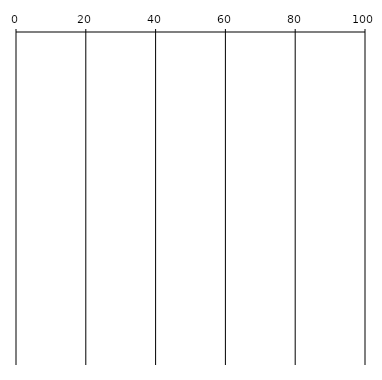
| Category | Series 0 | Series 1 | Series 2 | Series 3 | Series 4 | Series 5 | Series 6 | Series 7 | Series 8 | Series 9 | Series 10 | Series 11 | Series 12 |
|---|---|---|---|---|---|---|---|---|---|---|---|---|---|
| 0 | 0 | 0 | 0 | 0 | 0 | 0 | 0 | 0 | 0 | 0 | 0 | 0 | 0 |